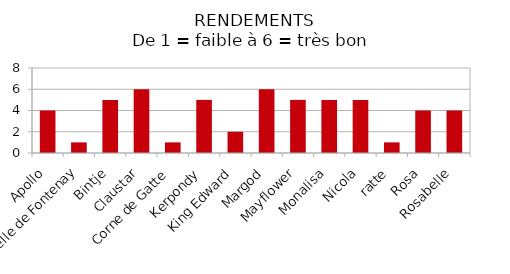
| Category | Rendement (1 à 6) |
|---|---|
| Apollo | 4 |
| Belle de Fontenay | 1 |
| Bintje | 5 |
| Claustar | 6 |
| Corne de Gatte | 1 |
| Kerpondy | 5 |
| King Edward | 2 |
| Margod  | 6 |
| Mayflower  | 5 |
| Monalisa | 5 |
| Nicola | 5 |
| ratte | 1 |
| Rosa | 4 |
| Rosabelle | 4 |